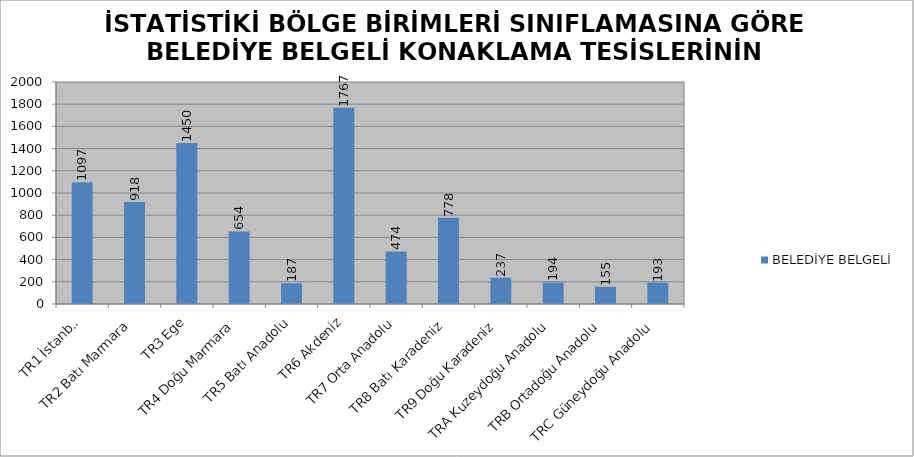
| Category | BELEDİYE BELGELİ |
|---|---|
| TR1 İstanbul | 1097 |
| TR2 Batı Marmara | 918 |
| TR3 Ege | 1450 |
| TR4 Doğu Marmara | 654 |
| TR5 Batı Anadolu | 187 |
| TR6 Akdeniz | 1767 |
| TR7 Orta Anadolu | 474 |
| TR8 Batı Karadeniz | 778 |
| TR9 Doğu Karadeniz | 237 |
| TRA Kuzeydoğu Anadolu | 194 |
| TRB Ortadoğu Anadolu | 155 |
| TRC Güneydoğu Anadolu | 193 |